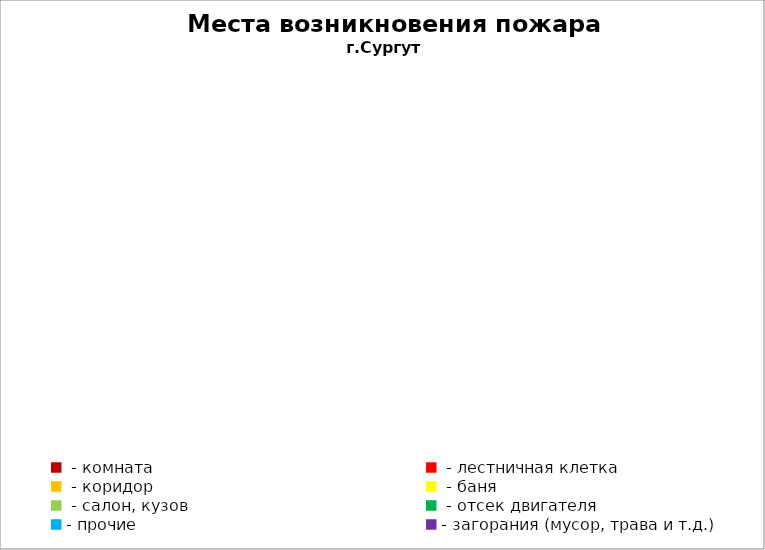
| Category | Места возникновения пожара |
|---|---|
|  - комната | 59 |
|  - лестничная клетка | 14 |
|  - коридор | 11 |
|  - баня | 33 |
|  - салон, кузов | 19 |
|  - отсек двигателя | 41 |
| - прочие | 86 |
| - загорания (мусор, трава и т.д.)  | 151 |